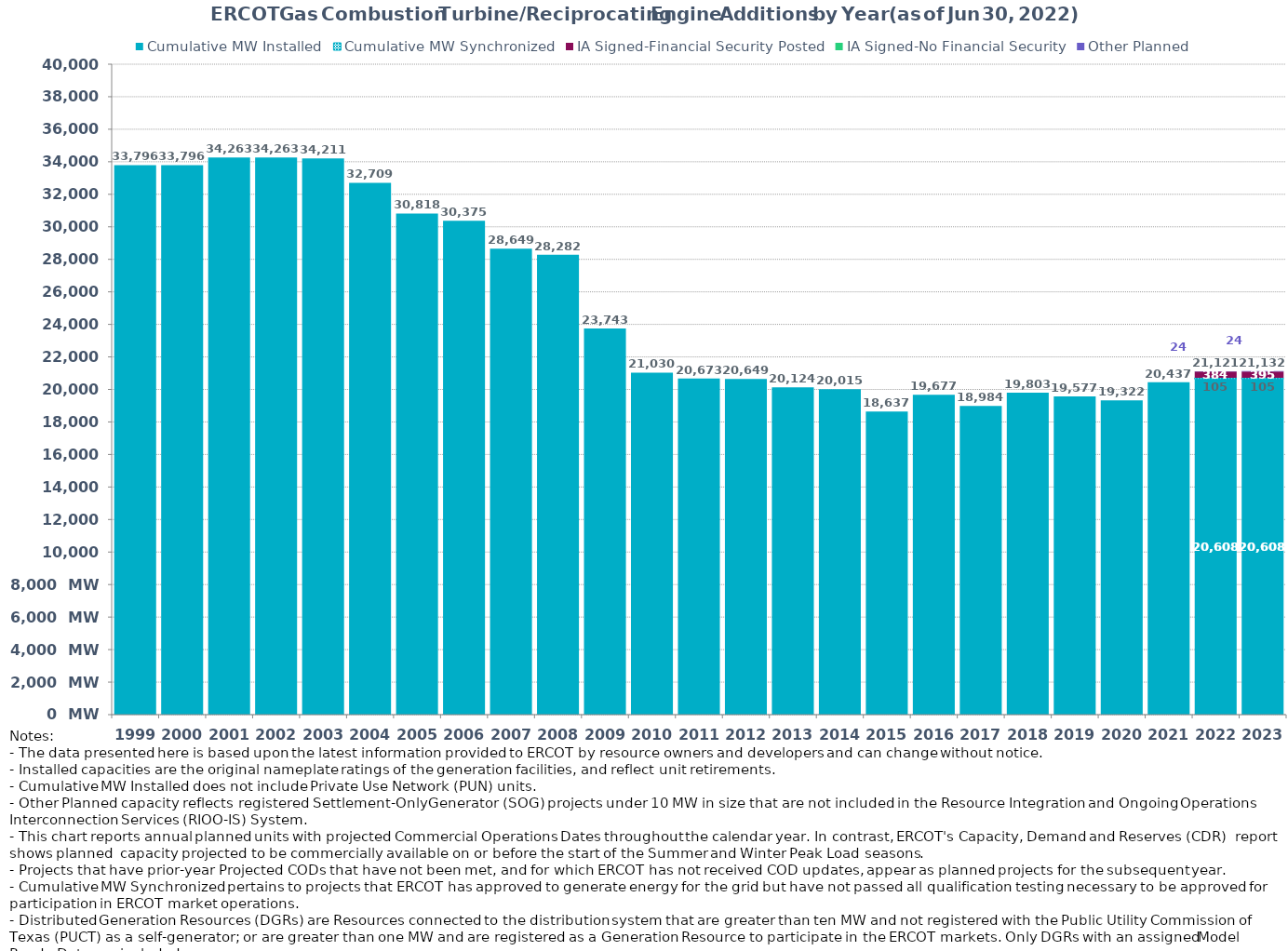
| Category | Cumulative MW Installed | Cumulative MW Synchronized | IA Signed-Financial Security Posted  | IA Signed-No Financial Security  | Other Planned | Cumulative Installed and Planned |
|---|---|---|---|---|---|---|
| 1999.0 | 33796.03 | 0 | 0 | 0 | 0 | 33796.03 |
| 2000.0 | 33796.03 | 0 | 0 | 0 | 0 | 33796.03 |
| 2001.0 | 34262.59 | 0 | 0 | 0 | 0 | 34262.59 |
| 2002.0 | 34262.59 | 0 | 0 | 0 | 0 | 34262.59 |
| 2003.0 | 34210.59 | 0 | 0 | 0 | 0 | 34210.59 |
| 2004.0 | 32708.69 | 0 | 0 | 0 | 0 | 32708.69 |
| 2005.0 | 30818 | 0 | 0 | 0 | 0 | 30818 |
| 2006.0 | 30375 | 0 | 0 | 0 | 0 | 30375 |
| 2007.0 | 28649 | 0 | 0 | 0 | 0 | 28649 |
| 2008.0 | 28282 | 0 | 0 | 0 | 0 | 28282 |
| 2009.0 | 23743.29 | 0 | 0 | 0 | 0 | 23743.29 |
| 2010.0 | 21030.17 | 0 | 0 | 0 | 0 | 21030.17 |
| 2011.0 | 20673.47 | 0 | 0 | 0 | 0 | 20673.47 |
| 2012.0 | 20649.47 | 0 | 0 | 0 | 0 | 20649.47 |
| 2013.0 | 20124.47 | 0 | 0 | 0 | 0 | 20124.47 |
| 2014.0 | 20015.47 | 0 | 0 | 0 | 0 | 20015.47 |
| 2015.0 | 18636.67 | 0 | 0 | 0 | 0 | 18636.67 |
| 2016.0 | 19677.05 | 0 | 0 | 0 | 0 | 19677.05 |
| 2017.0 | 18984.19 | 0 | 0 | 0 | 0 | 18984.19 |
| 2018.0 | 19803.35 | 0 | 0 | 0 | 0 | 19803.35 |
| 2019.0 | 19577.05 | 0 | 0 | 0 | 0 | 19577.05 |
| 2020.0 | 19322.4 | 0 | 0 | 0 | 0 | 19322.4 |
| 2021.0 | 20437.34 | 0 | 0 | 0 | 0 | 20437.34 |
| 2022.0 | 20607.94 | 105 | 384 | 0 | 23.7 | 21120.64 |
| 2023.0 | 20607.94 | 105 | 395 | 0 | 23.7 | 21131.64 |